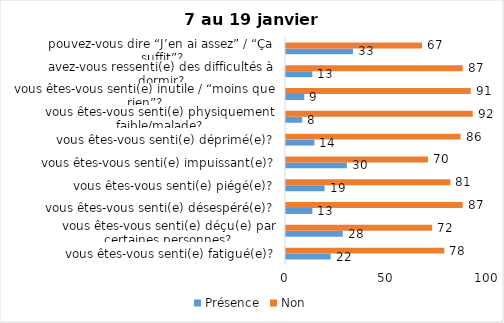
| Category | Présence | Non |
|---|---|---|
| vous êtes-vous senti(e) fatigué(e)? | 22 | 78 |
| vous êtes-vous senti(e) déçu(e) par certaines personnes? | 28 | 72 |
| vous êtes-vous senti(e) désespéré(e)? | 13 | 87 |
| vous êtes-vous senti(e) piégé(e)? | 19 | 81 |
| vous êtes-vous senti(e) impuissant(e)? | 30 | 70 |
| vous êtes-vous senti(e) déprimé(e)? | 14 | 86 |
| vous êtes-vous senti(e) physiquement faible/malade? | 8 | 92 |
| vous êtes-vous senti(e) inutile / “moins que rien”? | 9 | 91 |
| avez-vous ressenti(e) des difficultés à dormir? | 13 | 87 |
| pouvez-vous dire “J’en ai assez” / “Ça suffit”? | 33 | 67 |